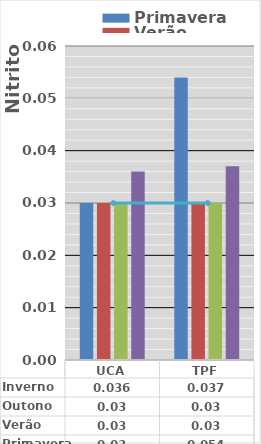
| Category | Primavera | Verão | Outono | Inverno |
|---|---|---|---|---|
| UCA | 0.03 | 0.03 | 0.03 | 0.036 |
| TPF | 0.054 | 0.03 | 0.03 | 0.037 |